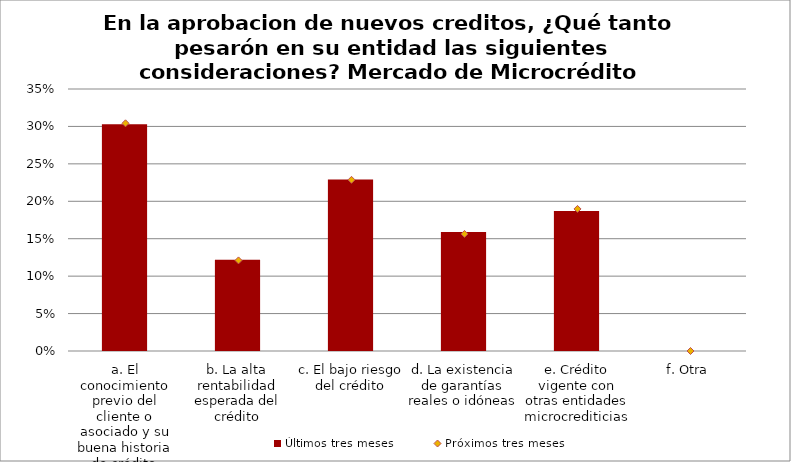
| Category | Últimos tres meses |
|---|---|
| a. El conocimiento previo del cliente o asociado y su buena historia de crédito | 0.303 |
| b. La alta rentabilidad esperada del crédito | 0.122 |
| c. El bajo riesgo del crédito | 0.229 |
| d. La existencia de garantías reales o idóneas | 0.159 |
| e. Crédito vigente con otras entidades microcrediticias | 0.187 |
| f. Otra | 0 |